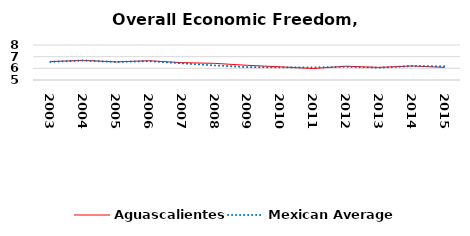
| Category | Aguascalientes | Mexican Average  |
|---|---|---|
| 2003.0 | 6.58 | 6.552 |
| 2004.0 | 6.684 | 6.668 |
| 2005.0 | 6.55 | 6.546 |
| 2006.0 | 6.65 | 6.619 |
| 2007.0 | 6.488 | 6.428 |
| 2008.0 | 6.427 | 6.248 |
| 2009.0 | 6.257 | 6.106 |
| 2010.0 | 6.129 | 6.086 |
| 2011.0 | 5.984 | 6.074 |
| 2012.0 | 6.183 | 6.134 |
| 2013.0 | 6.081 | 6.054 |
| 2014.0 | 6.201 | 6.2 |
| 2015.0 | 6.081 | 6.174 |